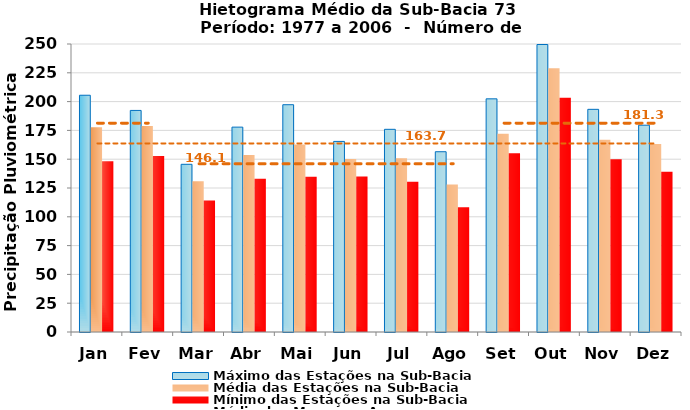
| Category | Máximo das Estações na Sub-Bacia | Média das Estações na Sub-Bacia | Mínimo das Estações na Sub-Bacia |
|---|---|---|---|
| Jan | 205.513 | 177.828 | 148.203 |
| Fev | 192.339 | 178.772 | 152.777 |
| Mar | 145.57 | 130.922 | 114.057 |
| Abr | 177.84 | 153.626 | 132.972 |
| Mai | 197.303 | 162.736 | 134.683 |
| Jun | 165.437 | 150.212 | 135.012 |
| Jul | 175.94 | 150.732 | 130.52 |
| Ago | 156.483 | 128.128 | 108.24 |
| Set | 202.393 | 172.134 | 155.093 |
| Out | 249.564 | 228.856 | 203.443 |
| Nov | 193.29 | 166.964 | 150.003 |
| Dez | 179.52 | 163.268 | 139.197 |